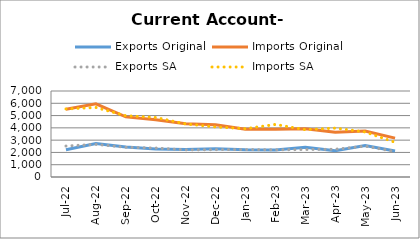
| Category | Exports Original | Imports Original | Exports SA | Imports SA |
|---|---|---|---|---|
| 2022-07-01 | 2215 | 5510 | 2521 | 5540 |
| 2022-08-01 | 2734 | 5951 | 2656 | 5657 |
| 2022-09-01 | 2437 | 4894 | 2419 | 4987 |
| 2022-10-01 | 2281 | 4653 | 2357 | 4848 |
| 2022-11-01 | 2248 | 4334 | 2208 | 4320 |
| 2022-12-01 | 2308 | 4247 | 2224 | 4073 |
| 2023-01-01 | 2222 | 3888 | 2234 | 3931 |
| 2023-02-01 | 2199 | 3878 | 2212 | 4278 |
| 2023-03-01 | 2420 | 3933 | 2235 | 3853 |
| 2023-04-01 | 2135 | 3635 | 2259 | 3981 |
| 2023-05-01 | 2568 | 3747 | 2507 | 3664 |
| 2023-06-01 | 2112 | 3164 | 2079 | 2823 |